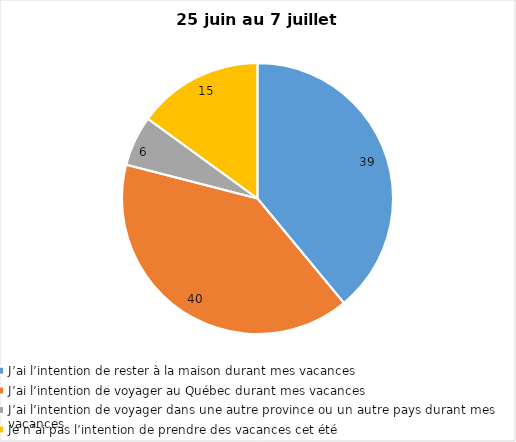
| Category | Series 0 |
|---|---|
| J’ai l’intention de rester à la maison durant mes vacances | 39 |
| J’ai l’intention de voyager au Québec durant mes vacances | 40 |
| J’ai l’intention de voyager dans une autre province ou un autre pays durant mes vacances | 6 |
| Je n’ai pas l’intention de prendre des vacances cet été | 15 |